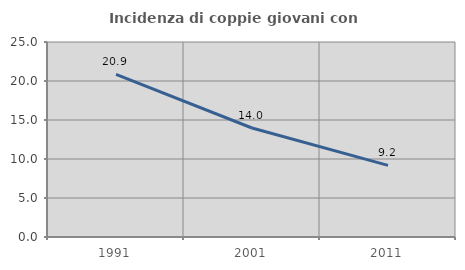
| Category | Incidenza di coppie giovani con figli |
|---|---|
| 1991.0 | 20.852 |
| 2001.0 | 13.973 |
| 2011.0 | 9.186 |